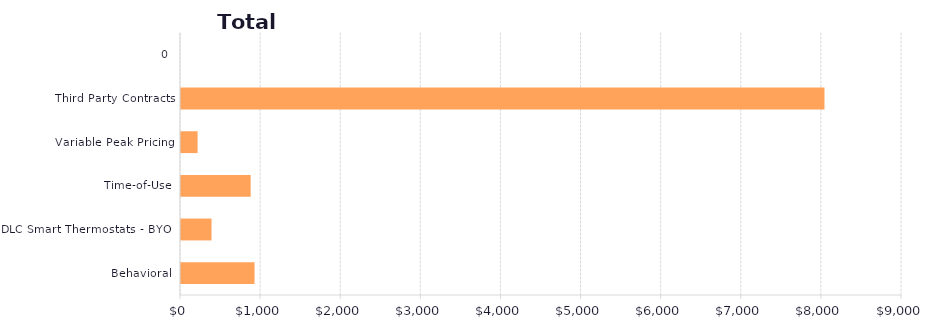
| Category | Series 1 |
|---|---|
| Behavioral | 918.147 |
| DLC Smart Thermostats - BYOT | 380.932 |
| Time-of-Use | 869.635 |
| Variable Peak Pricing | 206.887 |
| Third Party Contracts | 8032.322 |
| 0 | 0 |